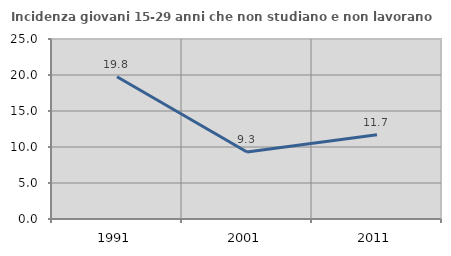
| Category | Incidenza giovani 15-29 anni che non studiano e non lavorano  |
|---|---|
| 1991.0 | 19.756 |
| 2001.0 | 9.311 |
| 2011.0 | 11.707 |